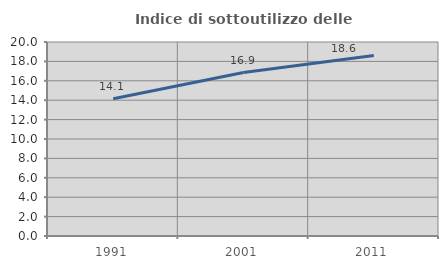
| Category | Indice di sottoutilizzo delle abitazioni  |
|---|---|
| 1991.0 | 14.147 |
| 2001.0 | 16.851 |
| 2011.0 | 18.62 |